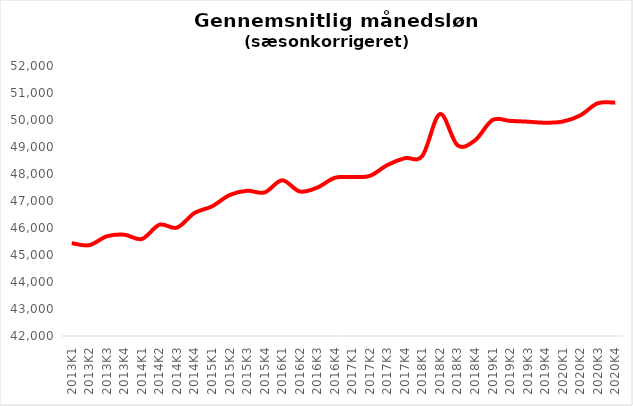
| Category | Series 0 |
|---|---|
| 2013K1 | 45438.609 |
| 2013K2 | 45363.863 |
| 2013K3 | 45692.535 |
| 2013K4 | 45752.009 |
| 2014K1 | 45594.035 |
| 2014K2 | 46120.051 |
| 2014K3 | 46013.4 |
| 2014K4 | 46555.368 |
| 2015K1 | 46801.621 |
| 2015K2 | 47218.832 |
| 2015K3 | 47379.388 |
| 2015K4 | 47316.425 |
| 2016K1 | 47766.271 |
| 2016K2 | 47353.234 |
| 2016K3 | 47496.318 |
| 2016K4 | 47858.197 |
| 2017K1 | 47886.567 |
| 2017K2 | 47929.617 |
| 2017K3 | 48331.234 |
| 2017K4 | 48586.331 |
| 2018K1 | 48671.92 |
| 2018K2 | 50220.09 |
| 2018K3 | 49064.708 |
| 2018K4 | 49246.397 |
| 2019K1 | 50000.107 |
| 2019K2 | 49966.781 |
| 2019K3 | 49938.09 |
| 2019K4 | 49899.269 |
| 2020K1 | 49942.056 |
| 2020K2 | 50168.116 |
| 2020K3 | 50619.353 |
| 2020K4 | 50642.668 |